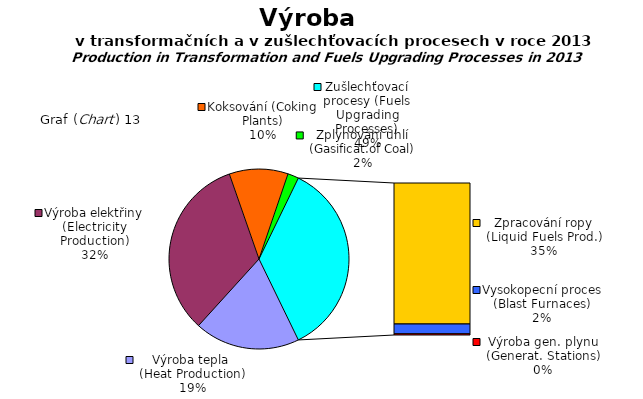
| Category | Series 0 |
|---|---|
| Výroba tepla (Heat Production) | 169046 |
| Výroba elektřiny (Electricity Production) | 293918.4 |
| Koksování (Coking Plants) | 94356.21 |
| Zplynování uhlí (Gasificat.of Coal) | 17672.449 |
| Zpracování ropy (Liquid Fuels Prod.) | 294764.833 |
| Vysokopecní proces (Blast Furnaces) | 20513.235 |
| Výroba gen. plynu (Generat. Stations) | 2486.165 |